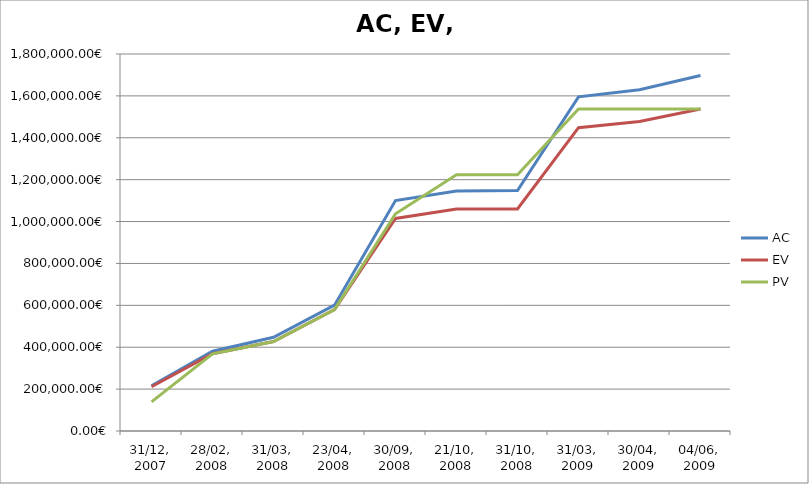
| Category | AC | EV | PV |
|---|---|---|---|
| 31/12, 2007 | 216156.35 | 211394.73 | 138800.3 |
| 28/02, 2008 | 381091.862 | 368676.402 | 368676.402 |
| 31/03, 2008 | 447206.412 | 427296.702 | 427296.702 |
| 23/04, 2008 | 600882.08 | 579666.56 | 579666.56 |
| 30/09, 2008 | 1100324.48 | 1014730.02 | 1037325.12 |
| 21/10, 2008 | 1145666.859 | 1059920.219 | 1223163.478 |
| 31/10, 2008 | 1147890.829 | 1059920.219 | 1223853.368 |
| 31/03, 2009 | 1595319.638 | 1448300.257 | 1537398.515 |
| 30/04, 2009 | 1629744.949 | 1478105.187 | 1537398.515 |
| 04/06, 2009 | 1696971.787 | 1537398.515 | 1537398.515 |